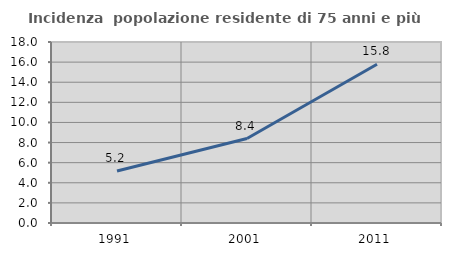
| Category | Incidenza  popolazione residente di 75 anni e più |
|---|---|
| 1991.0 | 5.172 |
| 2001.0 | 8.397 |
| 2011.0 | 15.789 |